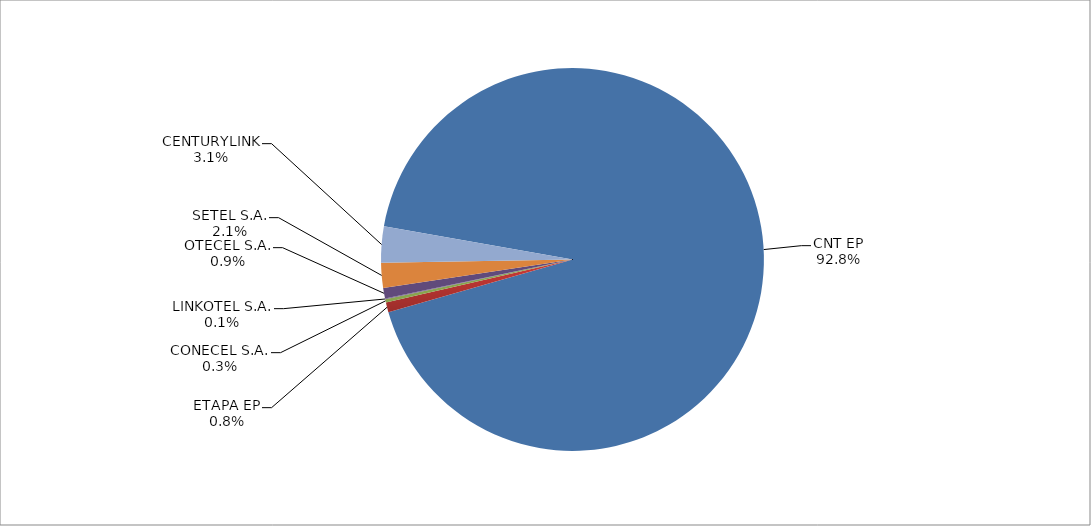
| Category | Series 0 |
|---|---|
| CNT EP | 2883 |
| ETAPA EP | 26 |
| CONECEL S.A. | 8 |
| LINKOTEL S.A. | 2 |
| OTECEL S.A. | 28 |
| SETEL S.A. | 65 |
| CENTURYLINK | 95 |